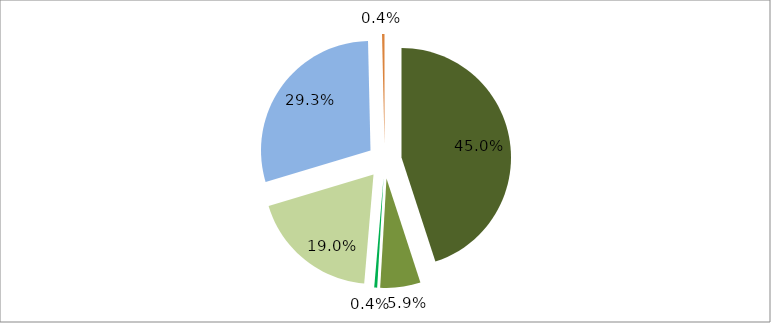
| Category | Series 0 |
|---|---|
| 0 | 0.45 |
| 1 | 0.059 |
| 2 | 0.004 |
| 3 | 0.19 |
| 4 | 0.293 |
| 5 | 0.004 |